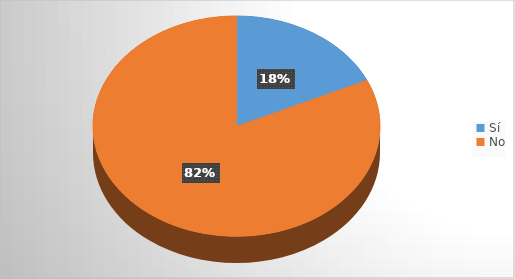
| Category | Series 0 |
|---|---|
| Sí | 222 |
| No | 1004 |